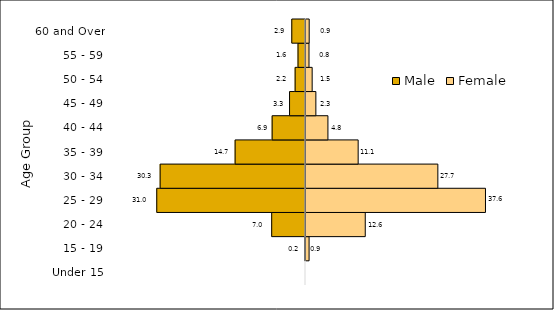
| Category | Male | Female |
|---|---|---|
| Under 15 | 0 | 0 |
| 15 - 19 | -0.181 | 0.851 |
| 20 - 24 | -7.042 | 12.554 |
| 25 - 29 | -30.987 | 37.6 |
| 30 - 34 | -30.281 | 27.676 |
| 35 - 39 | -14.663 | 11.077 |
| 40 - 44 | -6.949 | 4.776 |
| 45 - 49 | -3.322 | 2.263 |
| 50 - 54 | -2.16 | 1.494 |
| 55 - 59 | -1.558 | 0.837 |
| 60 and Over | -2.857 | 0.873 |